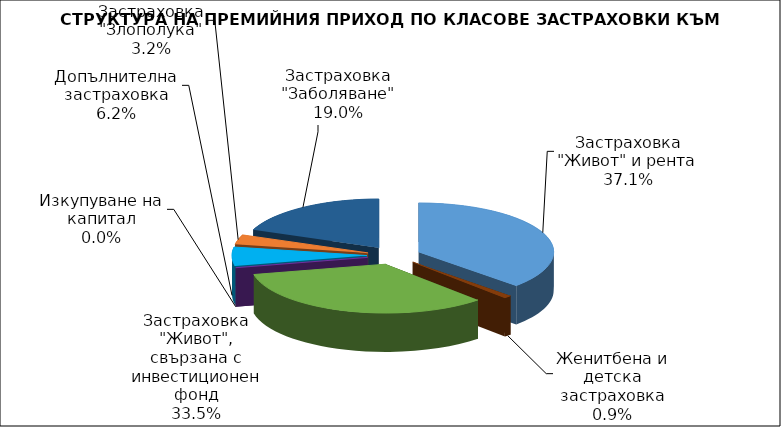
| Category | Застраховка "Живот" и рента |
|---|---|
| Застраховка "Живот" и рента | 83408397.261 |
| Женитбена и детска застраховка | 2057421.769 |
| Застраховка "Живот", свързана с инвестиционен фонд | 75342603.001 |
| Изкупуване на капитал | 0 |
| Допълнителна застраховка | 13909999.693 |
| Застраховка "Злополука" | 7204244.374 |
| Застраховка "Заболяване" | 42654394.264 |